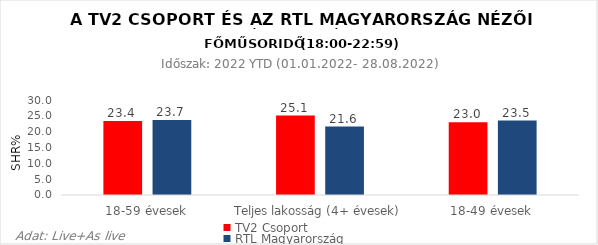
| Category | TV2 Csoport | RTL Magyarország |
|---|---|---|
| 18-59 évesek | 23.4 | 23.7 |
| Teljes lakosság (4+ évesek) | 25.1 | 21.6 |
| 18-49 évesek | 23 | 23.5 |